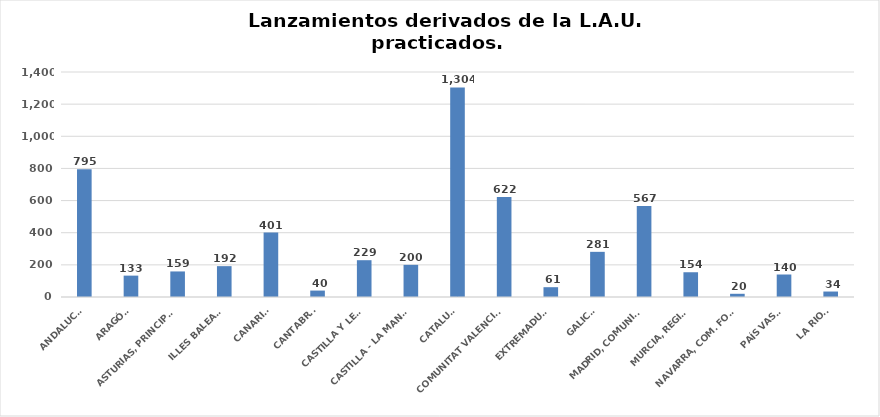
| Category | Series 0 |
|---|---|
| ANDALUCÍA | 795 |
| ARAGÓN | 133 |
| ASTURIAS, PRINCIPADO | 159 |
| ILLES BALEARS | 192 |
| CANARIAS | 401 |
| CANTABRIA | 40 |
| CASTILLA Y LEÓN | 229 |
| CASTILLA - LA MANCHA | 200 |
| CATALUÑA | 1304 |
| COMUNITAT VALENCIANA | 622 |
| EXTREMADURA | 61 |
| GALICIA | 281 |
| MADRID, COMUNIDAD | 567 |
| MURCIA, REGIÓN | 154 |
| NAVARRA, COM. FORAL | 20 |
| PAÍS VASCO | 140 |
| LA RIOJA | 34 |